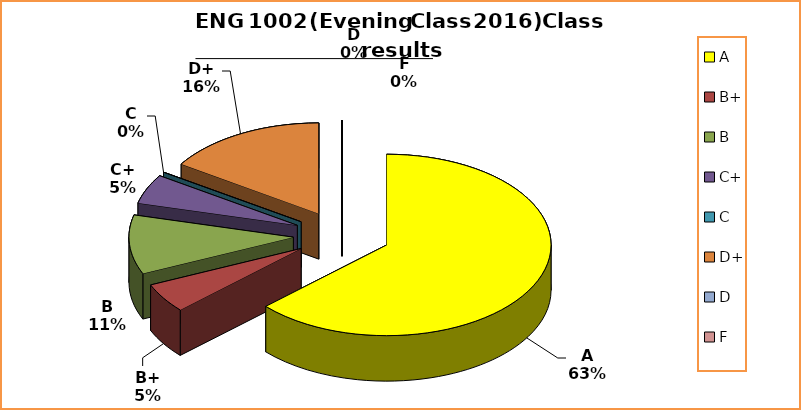
| Category | Series 0 |
|---|---|
| A | 12 |
| B+ | 1 |
| B | 2 |
| C+ | 1 |
| C | 0 |
| D+ | 3 |
| D | 0 |
| F | 0 |